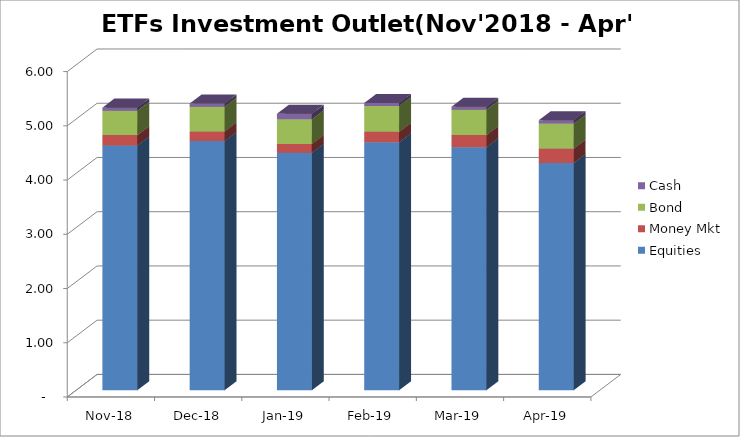
| Category | Equities | Money Mkt | Bond | Cash |
|---|---|---|---|---|
| 2018-11-01 | 4511471490.81 | 192561506.44 | 449623716.37 | 56722794.06 |
| 2018-12-01 | 4593226725.97 | 177224498.42 | 455822889.82 | 58868504.36 |
| 2019-01-01 | 4377264283.99 | 163856975.18 | 454756838.17 | 99509145.72 |
| 2019-02-01 | 4574101498.89 | 190249365.75 | 475081203.96 | 56714065.08 |
| 2019-03-01 | 4479173842.33 | 225580048.82 | 467336909.16 | 53276506 |
| 2019-04-01 | 4191729465.72 | 263468874.03 | 460460354.97 | 63029070.21 |